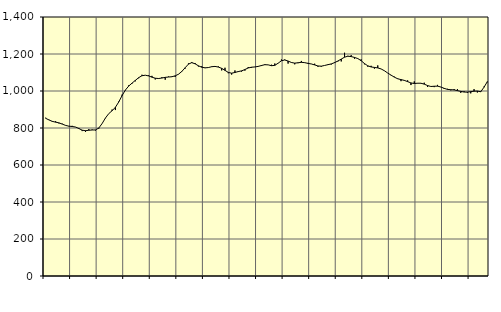
| Category | Piggar | Series 1 |
|---|---|---|
| nan | 855.5 | 852.33 |
| 87.0 | 844.7 | 843.5 |
| 87.0 | 833.2 | 835.86 |
| 87.0 | 836.4 | 831.51 |
| nan | 824.9 | 827.8 |
| 88.0 | 823.3 | 821.09 |
| 88.0 | 813.3 | 814.09 |
| 88.0 | 810.9 | 809.79 |
| nan | 811.6 | 808.12 |
| 89.0 | 804.9 | 805.28 |
| 89.0 | 800.1 | 797.21 |
| 89.0 | 783.3 | 788.25 |
| nan | 778.5 | 785.25 |
| 90.0 | 793.7 | 787.85 |
| 90.0 | 791.8 | 789.19 |
| 90.0 | 786.5 | 789.55 |
| nan | 796.2 | 799.88 |
| 91.0 | 824.5 | 824.07 |
| 91.0 | 853 | 853.96 |
| 91.0 | 877.2 | 877.69 |
| nan | 899.6 | 893.27 |
| 92.0 | 897 | 911.98 |
| 92.0 | 942.5 | 940.43 |
| 92.0 | 980.3 | 974.82 |
| nan | 1003.2 | 1005.1 |
| 93.0 | 1030.4 | 1026.45 |
| 93.0 | 1039.7 | 1042.43 |
| 93.0 | 1052.3 | 1057.24 |
| nan | 1069 | 1072.12 |
| 94.0 | 1087.9 | 1082.55 |
| 94.0 | 1085.5 | 1085.31 |
| 94.0 | 1084.8 | 1081.5 |
| nan | 1081.8 | 1074.77 |
| 95.0 | 1062.5 | 1069.05 |
| 95.0 | 1069.1 | 1067.45 |
| 95.0 | 1074.4 | 1070.1 |
| nan | 1060.9 | 1073.81 |
| 96.0 | 1078.2 | 1075.52 |
| 96.0 | 1078.7 | 1077.09 |
| 96.0 | 1076.2 | 1081.95 |
| nan | 1091.3 | 1090.7 |
| 97.0 | 1103.6 | 1105.63 |
| 97.0 | 1121 | 1125.7 |
| 97.0 | 1149.1 | 1145.35 |
| nan | 1156.8 | 1153.23 |
| 98.0 | 1151.4 | 1146.89 |
| 98.0 | 1132.5 | 1136.18 |
| 98.0 | 1133.9 | 1128.53 |
| nan | 1123.9 | 1125.25 |
| 99.0 | 1125.8 | 1126.72 |
| 99.0 | 1132.9 | 1131.29 |
| 99.0 | 1133.7 | 1132.92 |
| nan | 1132.7 | 1129.38 |
| 0.0 | 1111.4 | 1122.52 |
| 0.0 | 1125.7 | 1111.62 |
| 0.0 | 1096.1 | 1100.26 |
| nan | 1088.8 | 1096.35 |
| 1.0 | 1111.1 | 1100.13 |
| 1.0 | 1102.5 | 1105.09 |
| 1.0 | 1104.9 | 1108.84 |
| nan | 1110 | 1116.12 |
| 2.0 | 1129.6 | 1124.53 |
| 2.0 | 1125.5 | 1128.58 |
| 2.0 | 1129.5 | 1130 |
| nan | 1134.3 | 1133 |
| 3.0 | 1134.9 | 1137.9 |
| 3.0 | 1144.6 | 1142.18 |
| 3.0 | 1141 | 1141.28 |
| nan | 1142 | 1136.75 |
| 4.0 | 1148.6 | 1138.54 |
| 4.0 | 1151 | 1150.26 |
| 4.0 | 1170.2 | 1163.47 |
| nan | 1170 | 1167.6 |
| 5.0 | 1148.1 | 1161.96 |
| 5.0 | 1155.3 | 1154.13 |
| 5.0 | 1144.1 | 1150.6 |
| nan | 1150.6 | 1152.62 |
| 6.0 | 1162.5 | 1154.97 |
| 6.0 | 1154.2 | 1153.21 |
| 6.0 | 1151.7 | 1149.31 |
| nan | 1146.5 | 1146.07 |
| 7.0 | 1147.5 | 1140.99 |
| 7.0 | 1131 | 1135.23 |
| 7.0 | 1131.3 | 1134.19 |
| nan | 1138.3 | 1138.01 |
| 8.0 | 1143.9 | 1142.24 |
| 8.0 | 1143.3 | 1146.4 |
| 8.0 | 1156.1 | 1153.45 |
| nan | 1160 | 1162.23 |
| 9.0 | 1159.8 | 1172.54 |
| 9.0 | 1206.7 | 1182.73 |
| 9.0 | 1190.2 | 1188.09 |
| nan | 1193.8 | 1186.09 |
| 10.0 | 1174.6 | 1181.37 |
| 10.0 | 1176.1 | 1175.31 |
| 10.0 | 1170.8 | 1163.79 |
| nan | 1144.3 | 1148.43 |
| 11.0 | 1131.4 | 1136.17 |
| 11.0 | 1136.2 | 1129.91 |
| 11.0 | 1120.8 | 1127.41 |
| nan | 1138.3 | 1124.81 |
| 12.0 | 1119.3 | 1119.34 |
| 12.0 | 1109 | 1109.51 |
| 12.0 | 1096.9 | 1097.07 |
| nan | 1084.8 | 1085.88 |
| 13.0 | 1077.5 | 1074.86 |
| 13.0 | 1068 | 1066.1 |
| 13.0 | 1053.2 | 1061.66 |
| nan | 1059.4 | 1057.35 |
| 14.0 | 1057.5 | 1050.66 |
| 14.0 | 1032.1 | 1043.6 |
| 14.0 | 1051.7 | 1040.53 |
| nan | 1040.9 | 1042.11 |
| 15.0 | 1040.8 | 1041.98 |
| 15.0 | 1044.8 | 1037.03 |
| 15.0 | 1021.6 | 1029.44 |
| nan | 1024.2 | 1024.38 |
| 16.0 | 1021 | 1025.73 |
| 16.0 | 1033 | 1026.26 |
| 16.0 | 1021 | 1021.63 |
| nan | 1010.8 | 1014.31 |
| 17.0 | 1011.8 | 1008.67 |
| 17.0 | 1003.5 | 1007.08 |
| 17.0 | 1010.4 | 1005.76 |
| nan | 1009.9 | 1002.11 |
| 18.0 | 990 | 997.95 |
| 18.0 | 998.8 | 994.37 |
| 18.0 | 990.3 | 994.05 |
| nan | 987.3 | 996.5 |
| 19.0 | 1010.1 | 998.86 |
| 19.0 | 991.9 | 999.78 |
| 19.0 | 999.1 | 995.7 |
| nan | 1024 | 1020.38 |
| 20.0 | 1047 | 1050.74 |